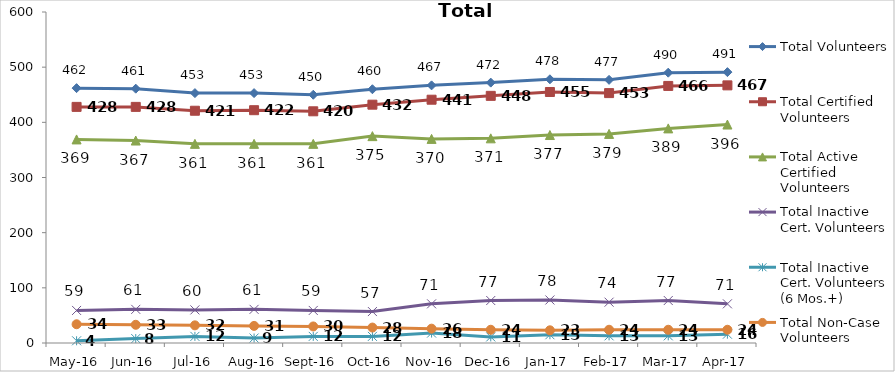
| Category | Total Volunteers | Total Certified Volunteers | Total Active Certified Volunteers | Total Inactive Cert. Volunteers | Total Inactive Cert. Volunteers (6 Mos.+) | Total Non-Case Volunteers |
|---|---|---|---|---|---|---|
| May-16 | 462 | 428 | 369 | 59 | 4 | 34 |
| Jun-16 | 461 | 428 | 367 | 61 | 8 | 33 |
| Jul-16 | 453 | 421 | 361 | 60 | 12 | 32 |
| Aug-16 | 453 | 422 | 361 | 61 | 9 | 31 |
| Sep-16 | 450 | 420 | 361 | 59 | 12 | 30 |
| Oct-16 | 460 | 432 | 375 | 57 | 12 | 28 |
| Nov-16 | 467 | 441 | 370 | 71 | 18 | 26 |
| Dec-16 | 472 | 448 | 371 | 77 | 11 | 24 |
| Jan-17 | 478 | 455 | 377 | 78 | 15 | 23 |
| Feb-17 | 477 | 453 | 379 | 74 | 13 | 24 |
| Mar-17 | 490 | 466 | 389 | 77 | 13 | 24 |
| Apr-17 | 491 | 467 | 396 | 71 | 16 | 24 |